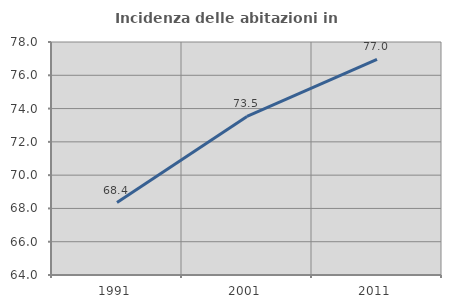
| Category | Incidenza delle abitazioni in proprietà  |
|---|---|
| 1991.0 | 68.352 |
| 2001.0 | 73.529 |
| 2011.0 | 76.963 |